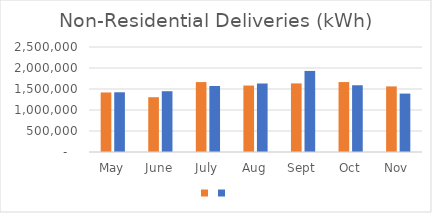
| Category | Series 1 | Series 0 |
|---|---|---|
| May | 1417925 | 1421957 |
| June | 1304116 | 1447306 |
| July | 1664865 | 1572197 |
| Aug | 1582276 | 1631031 |
| Sept | 1633351 | 1930305 |
| Oct | 1665276 | 1589224 |
| Nov | 1561812 | 1390925 |